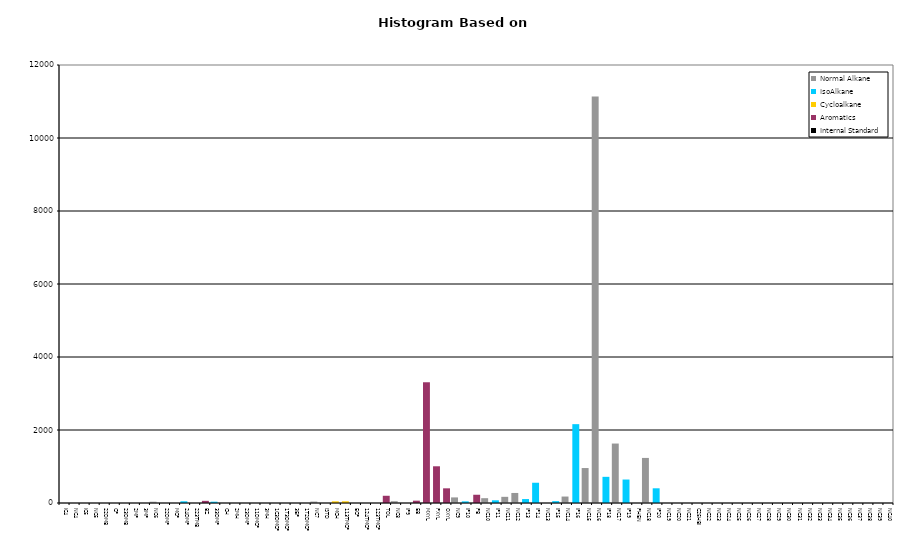
| Category | Normal Alkane | IsoAlkane | Cycloalkane | Aromatics | Internal Standard |
|---|---|---|---|---|---|
| IC4 | 0 | 0 | 0 | 0 | 0 |
| NC4 | 0 | 0 | 0 | 0 | 0 |
| IC5 | 0 | 0 | 0 | 0 | 0 |
| NC5 | 0 | 0 | 0 | 0 | 0 |
| 22DMB | 0 | 0 | 0 | 0 | 0 |
| CP | 0 | 0 | 0 | 0 | 0 |
| 23DMB | 0 | 0 | 0 | 0 | 0 |
| 2MP | 0 | 0 | 0 | 0 | 0 |
| 3MP | 0 | 0 | 0 | 0 | 0 |
| NC6 | 35 | 0 | 0 | 0 | 0 |
| 22DMP | 0 | 0 | 0 | 0 | 0 |
| MCP | 0 | 0 | 0 | 0 | 0 |
| 24DMP | 0 | 47 | 0 | 0 | 0 |
| 223TMB | 0 | 0 | 0 | 0 | 0 |
| BZ | 0 | 0 | 0 | 59 | 0 |
| 33DMP | 0 | 36 | 0 | 0 | 0 |
| CH | 0 | 0 | 0 | 0 | 0 |
| 2MH | 0 | 0 | 0 | 0 | 0 |
| 23DMP | 0 | 0 | 0 | 0 | 0 |
| 11DMCP | 0 | 0 | 0 | 0 | 0 |
| 3MH | 0 | 0 | 0 | 0 | 0 |
| 1C3DMCP | 0 | 0 | 0 | 0 | 0 |
| 1T3DMCP | 0 | 0 | 0 | 0 | 0 |
| 3EP | 0 | 0 | 0 | 0 | 0 |
| 1T2DMCP | 0 | 0 | 0 | 0 | 0 |
| NC7 | 39 | 0 | 0 | 0 | 0 |
| ISTD | 0 | 0 | 0 | 0 | 0 |
| MCH | 0 | 0 | 46 | 0 | 0 |
| 113TMCP | 0 | 0 | 47 | 0 | 0 |
| ECP | 0 | 0 | 0 | 0 | 0 |
| 124TMCP | 0 | 0 | 0 | 0 | 0 |
| 123TMCP | 0 | 0 | 0 | 0 | 0 |
| TOL | 0 | 0 | 0 | 198 | 0 |
| NC8 | 49 | 0 | 0 | 0 | 0 |
| IP9 | 0 | 0 | 0 | 0 | 0 |
| EB | 0 | 0 | 0 | 64 | 0 |
| MXYL | 0 | 0 | 0 | 3308 | 0 |
| PXYL | 0 | 0 | 0 | 1006 | 0 |
| OXYL | 0 | 0 | 0 | 402 | 0 |
| NC9 | 153 | 0 | 0 | 0 | 0 |
| IP10 | 0 | 45 | 0 | 0 | 0 |
| PB | 0 | 0 | 0 | 226 | 0 |
| NC10 | 132 | 0 | 0 | 0 | 0 |
| IP11 | 0 | 74 | 0 | 0 | 0 |
| NC11 | 169 | 0 | 0 | 0 | 0 |
| NC12 | 275 | 0 | 0 | 0 | 0 |
| IP13 | 0 | 108 | 0 | 0 | 0 |
| IP14 | 0 | 555 | 0 | 0 | 0 |
| NC13 | 0 | 0 | 0 | 0 | 0 |
| IP15 | 0 | 51 | 0 | 0 | 0 |
| NC14 | 177 | 0 | 0 | 0 | 0 |
| IP16 | 0 | 2160 | 0 | 0 | 0 |
| NC15 | 958 | 0 | 0 | 0 | 0 |
| NC16 | 11139 | 0 | 0 | 0 | 0 |
| IP18 | 0 | 717 | 0 | 0 | 0 |
| NC17 | 1629 | 0 | 0 | 0 | 0 |
| IP19 | 0 | 643 | 0 | 0 | 0 |
| PHEN | 0 | 0 | 0 | 0 | 0 |
| NC18 | 1235 | 0 | 0 | 0 | 0 |
| IP20 | 0 | 403 | 0 | 0 | 0 |
| NC19 | 0 | 0 | 0 | 0 | 0 |
| NC20 | 0 | 0 | 0 | 0 | 0 |
| NC21 | 0 | 0 | 0 | 0 | 0 |
| C25HBI | 0 | 0 | 0 | 0 | 0 |
| NC22 | 0 | 0 | 0 | 0 | 0 |
| NC23 | 0 | 0 | 0 | 0 | 0 |
| NC24 | 0 | 0 | 0 | 0 | 0 |
| NC25 | 0 | 0 | 0 | 0 | 0 |
| NC26 | 0 | 0 | 0 | 0 | 0 |
| NC27 | 0 | 0 | 0 | 0 | 0 |
| NC28 | 0 | 0 | 0 | 0 | 0 |
| NC29 | 0 | 0 | 0 | 0 | 0 |
| NC30 | 0 | 0 | 0 | 0 | 0 |
| NC31 | 0 | 0 | 0 | 0 | 0 |
| NC32 | 0 | 0 | 0 | 0 | 0 |
| NC33 | 0 | 0 | 0 | 0 | 0 |
| NC34 | 0 | 0 | 0 | 0 | 0 |
| NC35 | 0 | 0 | 0 | 0 | 0 |
| NC36 | 0 | 0 | 0 | 0 | 0 |
| NC37 | 0 | 0 | 0 | 0 | 0 |
| NC38 | 0 | 0 | 0 | 0 | 0 |
| NC39 | 0 | 0 | 0 | 0 | 0 |
| NC40 | 0 | 0 | 0 | 0 | 0 |